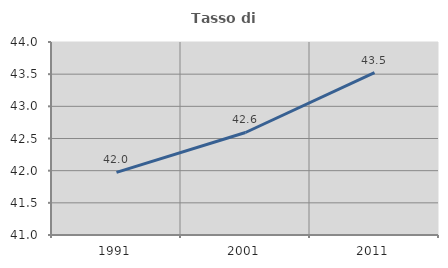
| Category | Tasso di occupazione   |
|---|---|
| 1991.0 | 41.973 |
| 2001.0 | 42.593 |
| 2011.0 | 43.524 |